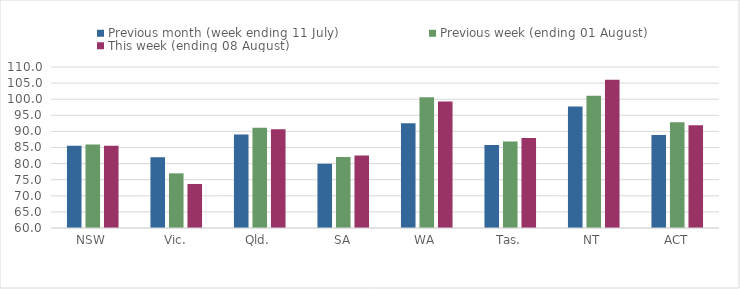
| Category | Previous month (week ending 11 July) | Previous week (ending 01 August) | This week (ending 08 August) |
|---|---|---|---|
| NSW | 85.531 | 85.969 | 85.533 |
| Vic. | 81.985 | 76.974 | 73.675 |
| Qld. | 89.034 | 91.127 | 90.637 |
| SA | 79.974 | 82.062 | 82.524 |
| WA | 92.545 | 100.588 | 99.296 |
| Tas. | 85.811 | 86.829 | 87.931 |
| NT | 97.734 | 101.039 | 106.045 |
| ACT | 88.912 | 92.816 | 91.912 |